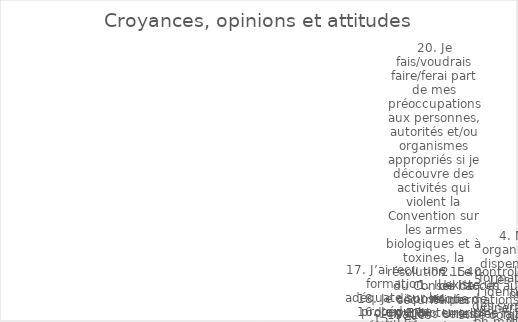
| Category | Series 0 |
|---|---|
| 1. Il existe un risque de bioterrorisme ou d’attaque avec une arme biologique. | 4 |
| 2. Le contrôle de l’accès aux informations sensibles fait partie intégrante de la biosûreté. | 2 |
| 3. Je comprends l’importance de la détermination de la fidélité. | 5 |
| 4. Mon organisation dispense une formation sur l’identification des symptômes d’un comportement à haut risque chez soi et chez les autres. | 1 |
| 5. Les lacunes ou vulnérabilités en matière de biosécurité et/ou de biosûreté sont corrigées avec un sentiment d’urgence. | 0 |
| 6. Je suis fier de mon travail. | 4 |
| 7. Mon organisation et ses membres encouragent le travail d’équipe et la coopération. | 3 |
| 8. Les infractions en matière de biosécurité et de biosûreté sont traitées de manière appropriée. | 4 |
| 9. Mon organisation se soucie plus de la biosécurité que des résultats de notre travail. | 1 |
| 10. Je suis conscient qu’il y a des problèmes et des conséquences éthiques, juridiques et sociétaux liés à mes recherches. | 4 |
| 11. L’expertise technique et l’expérience soutiennent l’assurance des performances futures en matière de biosécurité. | 2 |
| 12. Dans mon organisation, les individus ont les compétences appropriées pour effectuer les tâches qui leur sont assignées et pour travailler de manière sécuritaire et efficace. | 3 |
| 13. Mon organisation a une culture qui soutient et encourage la confiance, la collaboration, la consultation et la communication en matière de biosécurité et de biosûreté. | 4 |
| 14. La politique et la législation nationales relatives aux sciences de la vie visent à assurer une protection contre le mésusage de la science.6 | 4 |
| 15. Les évaluations des risques sont des outils importants pour identifier les domaines à améliorer et des mesures spécifiques pour réduire les risques, y compris le niveau de confinement requis. | 1 |
| 16. Je pense qu’il est important de signaler non seulement les accidents et incidents de laboratoire, mais aussi les quasi-accidents. | 3 |
| 17. J’ai reçu une formation adéquate sur les procédures nécessaires pour effectuer mon travail sans compromettre la sécurité et la sûreté. | 3 |
| 18. Je dispose d’un EPI adéquat pour effectuer mon travail en toute sécurité. | 4 |
| 19. Les scientifiques ont l’obligation de ne pas nuire . | 4 |
| 20. Je fais/voudrais faire/ferai part de mes préoccupations aux personnes, autorités et/ou organismes appropriés si je découvre des activités qui violent la Convention sur les armes biologiques et à toxines, la résolution 1540 du Conseil de sécurité des N | 1 |